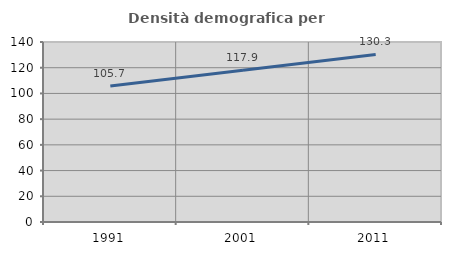
| Category | Densità demografica |
|---|---|
| 1991.0 | 105.69 |
| 2001.0 | 117.949 |
| 2011.0 | 130.341 |